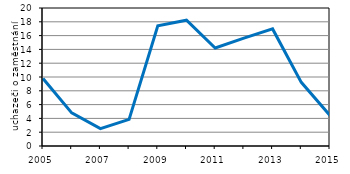
| Category | Series 0 |
|---|---|
| 2005.0 | 9.785 |
| 2006.0 | 4.801 |
| 2007.0 | 2.516 |
| 2008.0 | 3.863 |
| 2009.0 | 17.433 |
| 2010.0 | 18.23 |
| 2011.0 | 14.209 |
| 2012.0 | 15.628 |
| 2013.0 | 16.966 |
| 2014.0 | 9.226 |
| 2015.0 | 4.419 |